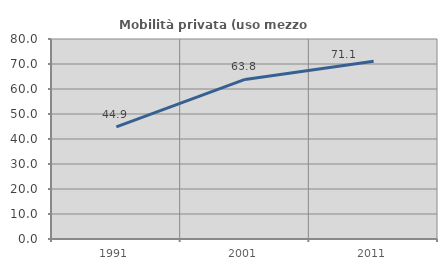
| Category | Mobilità privata (uso mezzo privato) |
|---|---|
| 1991.0 | 44.869 |
| 2001.0 | 63.843 |
| 2011.0 | 71.072 |